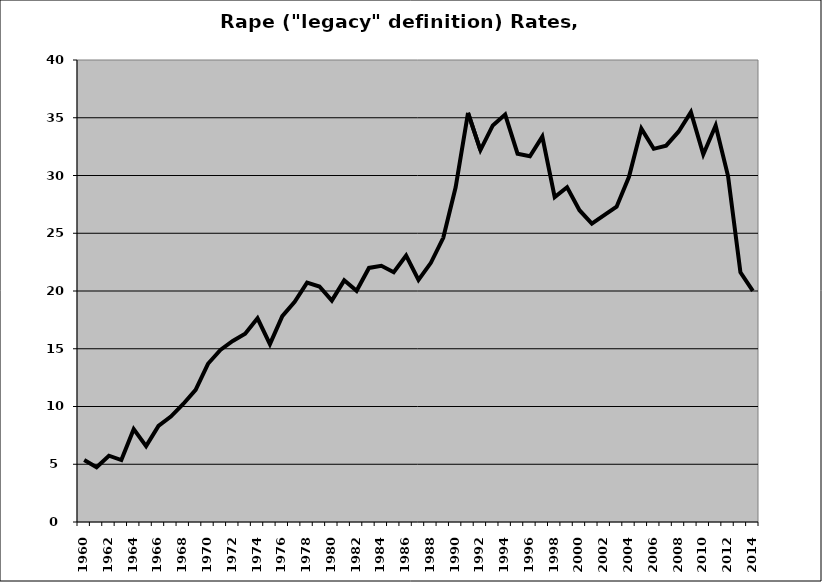
| Category | Rape |
|---|---|
| 1960.0 | 5.365 |
| 1961.0 | 4.746 |
| 1962.0 | 5.743 |
| 1963.0 | 5.363 |
| 1964.0 | 8.041 |
| 1965.0 | 6.574 |
| 1966.0 | 8.325 |
| 1967.0 | 9.125 |
| 1968.0 | 10.22 |
| 1969.0 | 11.448 |
| 1970.0 | 13.699 |
| 1971.0 | 14.899 |
| 1972.0 | 15.671 |
| 1973.0 | 16.308 |
| 1974.0 | 17.635 |
| 1975.0 | 15.4 |
| 1976.0 | 17.824 |
| 1977.0 | 19.057 |
| 1978.0 | 20.726 |
| 1979.0 | 20.386 |
| 1980.0 | 19.168 |
| 1981.0 | 20.923 |
| 1982.0 | 20.016 |
| 1983.0 | 21.998 |
| 1984.0 | 22.186 |
| 1985.0 | 21.632 |
| 1986.0 | 23.069 |
| 1987.0 | 20.955 |
| 1988.0 | 22.44 |
| 1989.0 | 24.604 |
| 1990.0 | 28.98 |
| 1991.0 | 35.416 |
| 1992.0 | 32.197 |
| 1993.0 | 34.336 |
| 1994.0 | 35.276 |
| 1995.0 | 31.891 |
| 1996.0 | 31.668 |
| 1997.0 | 33.367 |
| 1998.0 | 28.125 |
| 1999.0 | 28.984 |
| 2000.0 | 26.993 |
| 2001.0 | 25.831 |
| 2002.0 | 26.578 |
| 2003.0 | 27.294 |
| 2004.0 | 29.89 |
| 2005.0 | 34.055 |
| 2006.0 | 32.31 |
| 2007.0 | 32.583 |
| 2008.0 | 33.793 |
| 2009.0 | 35.488 |
| 2010.0 | 31.825 |
| 2011.0 | 34.327 |
| 2012.0 | 29.956 |
| 2013.0 | 21.616 |
| 2014.0 | 20.007 |